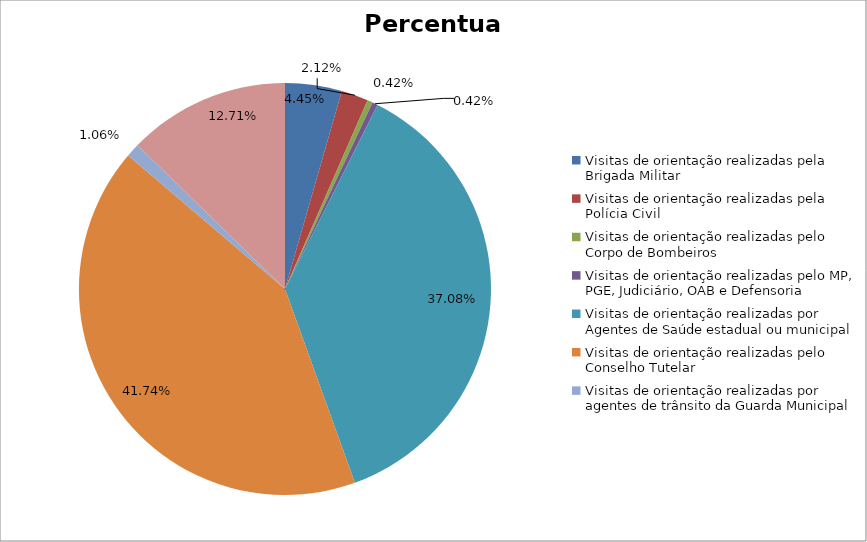
| Category | Percentual |
|---|---|
| Visitas de orientação realizadas pela Brigada Militar | 0.044 |
| Visitas de orientação realizadas pela Polícia Civil | 0.021 |
| Visitas de orientação realizadas pelo Corpo de Bombeiros | 0.004 |
| Visitas de orientação realizadas pelo MP, PGE, Judiciário, OAB e Defensoria | 0.004 |
| Visitas de orientação realizadas por Agentes de Saúde estadual ou municipal | 0.371 |
| Visitas de orientação realizadas pelo Conselho Tutelar | 0.417 |
| Visitas de orientação realizadas por agentes de trânsito da Guarda Municipal | 0.011 |
| Visitas de orientação realizadas por ONGs, entidades privadas, CRAS e CREAS | 0.127 |